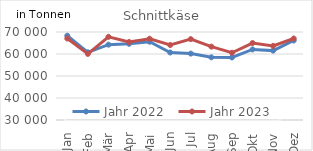
| Category | Jahr 2022 | Jahr 2023 |
|---|---|---|
| Jan | 68319.199 | 67047.906 |
| Feb | 60773.641 | 60054.326 |
| Mär | 64252.356 | 67801.37 |
| Apr | 64646.323 | 65440.916 |
| Mai | 65572.543 | 66941.631 |
| Jun | 60683.222 | 64086.714 |
| Jul | 60183.67 | 66760.759 |
| Aug | 58483.015 | 63352.91 |
| Sep | 58433.921 | 60563.637 |
| Okt | 62075.361 | 64974.521 |
| Nov | 61535.526 | 63698.08 |
| Dez | 66140.932 | 67042.421 |